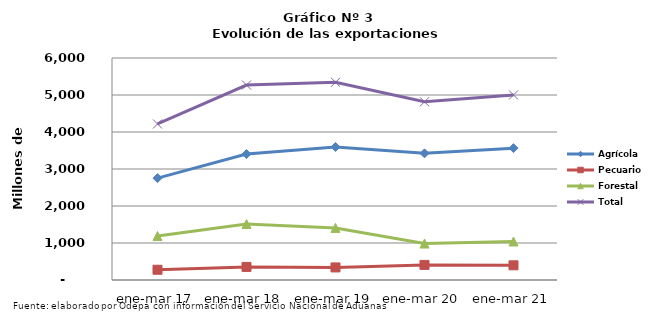
| Category | Agrícola | Pecuario | Forestal | Total |
|---|---|---|---|---|
| ene-mar 17 | 2752616 | 276961 | 1187824 | 4217401 |
| ene-mar 18 | 3402459 | 353570 | 1513784 | 5269813 |
| ene-mar 19 | 3595512 | 339813 | 1408089 | 5343414 |
| ene-mar 20 | 3423527 | 407818 | 985188 | 4816533 |
| ene-mar 21 | 3563657 | 397135 | 1041247 | 5002039 |